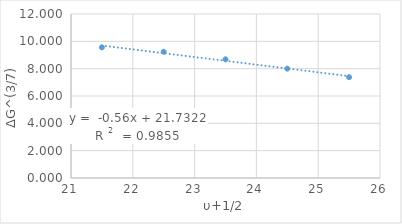
| Category | Series 0 |
|---|---|
| 21.5 | 9.561 |
| 22.5 | 9.237 |
| 23.5 | 8.684 |
| 24.5 | 8 |
| 25.5 | 7.379 |